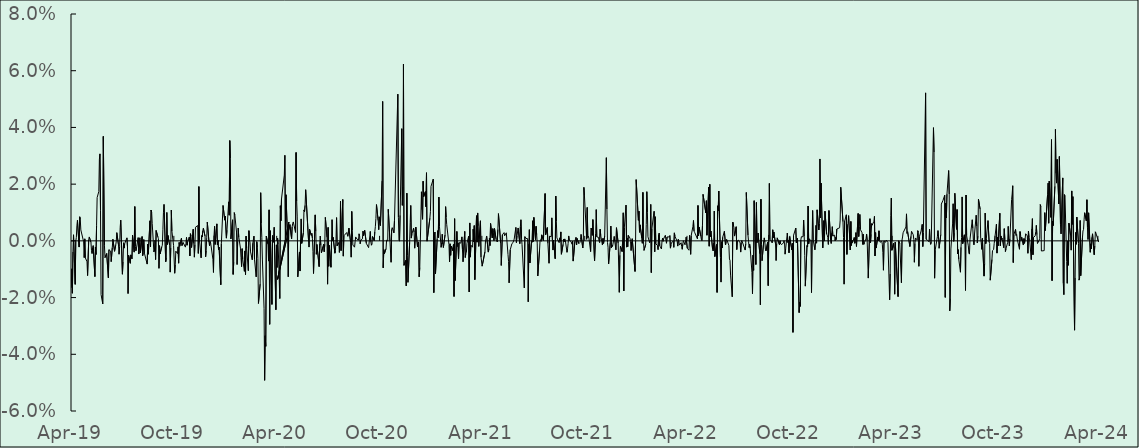
| Category | Series 0 |
|---|---|
| 2019-04-01 | -0.017 |
| 2019-04-02 | -0.01 |
| 2019-04-03 | -0.018 |
| 2019-04-04 | -0.004 |
| 2019-04-05 | 0.002 |
| 2019-04-08 | -0.015 |
| 2019-04-09 | 0 |
| 2019-04-10 | 0.001 |
| 2019-04-11 | 0.005 |
| 2019-04-12 | 0.007 |
| 2019-04-15 | -0.002 |
| 2019-04-16 | 0.008 |
| 2019-04-17 | 0.008 |
| 2019-04-18 | 0.004 |
| 2019-04-23 | 0 |
| 2019-04-24 | -0.006 |
| 2019-04-25 | 0.001 |
| 2019-04-26 | -0.006 |
| 2019-04-29 | -0.007 |
| 2019-04-30 | -0.012 |
| 2019-05-02 | 0 |
| 2019-05-03 | 0.001 |
| 2019-05-06 | -0.001 |
| 2019-05-07 | -0.003 |
| 2019-05-08 | -0.004 |
| 2019-05-09 | -0.002 |
| 2019-05-10 | -0.002 |
| 2019-05-13 | -0.013 |
| 2019-05-14 | -0.002 |
| 2019-05-15 | -0.005 |
| 2019-05-16 | 0.005 |
| 2019-05-17 | 0.015 |
| 2019-05-20 | 0.017 |
| 2019-05-21 | 0.029 |
| 2019-05-22 | 0.031 |
| 2019-05-23 | 0.011 |
| 2019-05-24 | -0.019 |
| 2019-05-27 | -0.022 |
| 2019-05-28 | 0.037 |
| 2019-05-30 | -0.002 |
| 2019-05-31 | -0.006 |
| 2019-06-03 | -0.004 |
| 2019-06-06 | -0.013 |
| 2019-06-07 | -0.003 |
| 2019-06-10 | -0.004 |
| 2019-06-11 | -0.007 |
| 2019-06-13 | -0.002 |
| 2019-06-14 | 0.001 |
| 2019-06-17 | -0.004 |
| 2019-06-18 | -0.004 |
| 2019-06-19 | -0.002 |
| 2019-06-20 | 0 |
| 2019-06-21 | 0.003 |
| 2019-06-24 | -0.001 |
| 2019-06-25 | -0.005 |
| 2019-06-26 | -0.002 |
| 2019-06-27 | 0.005 |
| 2019-06-28 | 0.007 |
| 2019-07-01 | -0.012 |
| 2019-07-02 | -0.007 |
| 2019-07-03 | -0.001 |
| 2019-07-04 | -0.003 |
| 2019-07-05 | -0.001 |
| 2019-07-08 | 0.001 |
| 2019-07-09 | 0.001 |
| 2019-07-10 | -0.002 |
| 2019-07-11 | -0.019 |
| 2019-07-12 | -0.005 |
| 2019-07-15 | -0.008 |
| 2019-07-16 | -0.005 |
| 2019-07-17 | -0.006 |
| 2019-07-18 | -0.006 |
| 2019-07-19 | 0.002 |
| 2019-07-22 | -0.004 |
| 2019-07-23 | 0.012 |
| 2019-07-24 | -0.002 |
| 2019-07-25 | -0.003 |
| 2019-07-26 | -0.003 |
| 2019-07-29 | 0.001 |
| 2019-07-30 | -0.005 |
| 2019-07-31 | -0.004 |
| 2019-08-01 | 0.001 |
| 2019-08-02 | -0.004 |
| 2019-08-05 | 0.002 |
| 2019-08-06 | -0.005 |
| 2019-08-07 | -0.004 |
| 2019-08-08 | 0 |
| 2019-08-09 | -0.004 |
| 2019-08-14 | -0.008 |
| 2019-08-15 | -0.001 |
| 2019-08-16 | -0.005 |
| 2019-08-19 | 0.007 |
| 2019-08-20 | -0.002 |
| 2019-08-21 | 0.011 |
| 2019-08-22 | 0.01 |
| 2019-08-23 | 0.006 |
| 2019-08-26 | -0.004 |
| 2019-08-27 | -0.003 |
| 2019-08-28 | 0 |
| 2019-08-29 | -0.007 |
| 2019-08-30 | 0.004 |
| 2019-09-02 | 0.001 |
| 2019-09-03 | 0.001 |
| 2019-09-04 | -0.01 |
| 2019-09-05 | -0.002 |
| 2019-09-06 | -0.005 |
| 2019-09-09 | -0.002 |
| 2019-09-10 | -0.002 |
| 2019-09-11 | 0.004 |
| 2019-09-12 | 0.01 |
| 2019-09-13 | 0.013 |
| 2019-09-16 | -0.007 |
| 2019-09-17 | -0.006 |
| 2019-09-18 | 0.01 |
| 2019-09-19 | -0.001 |
| 2019-09-20 | 0.002 |
| 2019-09-23 | -0.001 |
| 2019-09-24 | -0.011 |
| 2019-09-25 | -0.003 |
| 2019-09-26 | 0.011 |
| 2019-09-27 | 0.003 |
| 2019-09-30 | -0.002 |
| 2019-10-02 | -0.011 |
| 2019-10-03 | -0.008 |
| 2019-10-04 | -0.004 |
| 2019-10-07 | -0.004 |
| 2019-10-08 | -0.002 |
| 2019-10-09 | -0.008 |
| 2019-10-10 | -0.001 |
| 2019-10-11 | -0.002 |
| 2019-10-14 | 0.001 |
| 2019-10-15 | -0.002 |
| 2019-10-16 | -0.002 |
| 2019-10-17 | -0.001 |
| 2019-10-18 | 0 |
| 2019-10-21 | -0.002 |
| 2019-10-22 | -0.001 |
| 2019-10-23 | 0.001 |
| 2019-10-24 | -0.002 |
| 2019-10-25 | 0 |
| 2019-10-28 | 0.001 |
| 2019-10-29 | -0.005 |
| 2019-10-30 | 0.003 |
| 2019-10-31 | 0.002 |
| 2019-11-01 | -0.002 |
| 2019-11-04 | 0.004 |
| 2019-11-05 | -0.001 |
| 2019-11-06 | -0.006 |
| 2019-11-07 | -0.001 |
| 2019-11-08 | 0.005 |
| 2019-11-12 | 0.005 |
| 2019-11-13 | -0.004 |
| 2019-11-14 | 0.019 |
| 2019-11-15 | 0 |
| 2019-11-18 | -0.006 |
| 2019-11-19 | 0.002 |
| 2019-11-20 | 0.001 |
| 2019-11-21 | 0.004 |
| 2019-11-22 | 0.004 |
| 2019-11-25 | 0.002 |
| 2019-11-26 | -0.006 |
| 2019-11-27 | -0.003 |
| 2019-11-28 | 0.001 |
| 2019-11-29 | 0.007 |
| 2019-12-02 | 0 |
| 2019-12-03 | -0.002 |
| 2019-12-04 | 0 |
| 2019-12-05 | -0.001 |
| 2019-12-06 | -0.002 |
| 2019-12-09 | -0.006 |
| 2019-12-10 | -0.011 |
| 2019-12-11 | 0.002 |
| 2019-12-12 | 0.005 |
| 2019-12-13 | -0.001 |
| 2019-12-16 | 0.006 |
| 2019-12-17 | -0.001 |
| 2019-12-18 | 0 |
| 2019-12-19 | -0.003 |
| 2019-12-20 | -0.002 |
| 2019-12-23 | -0.015 |
| 2019-12-24 | -0.001 |
| 2019-12-27 | 0.012 |
| 2019-12-30 | 0.007 |
| 2019-12-31 | 0.009 |
| 2020-01-02 | 0.001 |
| 2020-01-03 | 0.004 |
| 2020-01-06 | 0.014 |
| 2020-01-07 | 0.009 |
| 2020-01-08 | 0.035 |
| 2020-01-09 | 0.029 |
| 2020-01-10 | 0.001 |
| 2020-01-13 | 0.007 |
| 2020-01-14 | -0.012 |
| 2020-01-15 | -0.008 |
| 2020-01-16 | 0.01 |
| 2020-01-17 | 0.009 |
| 2020-01-20 | 0.003 |
| 2020-01-21 | -0.008 |
| 2020-01-22 | 0 |
| 2020-01-23 | 0.005 |
| 2020-01-24 | 0.001 |
| 2020-01-27 | -0.003 |
| 2020-01-28 | -0.006 |
| 2020-01-29 | -0.009 |
| 2020-01-30 | -0.003 |
| 2020-01-31 | -0.006 |
| 2020-02-03 | -0.011 |
| 2020-02-04 | -0.004 |
| 2020-02-05 | -0.012 |
| 2020-02-06 | 0.002 |
| 2020-02-07 | -0.003 |
| 2020-02-10 | -0.011 |
| 2020-02-11 | 0.004 |
| 2020-02-12 | 0 |
| 2020-02-13 | 0 |
| 2020-02-14 | -0.004 |
| 2020-02-17 | -0.007 |
| 2020-02-18 | -0.001 |
| 2020-02-19 | -0.001 |
| 2020-02-20 | 0.002 |
| 2020-02-21 | -0.007 |
| 2020-02-24 | -0.013 |
| 2020-02-25 | 0 |
| 2020-02-26 | -0.002 |
| 2020-02-27 | -0.006 |
| 2020-02-28 | -0.022 |
| 2020-03-02 | -0.015 |
| 2020-03-03 | 0.017 |
| 2020-03-04 | 0.006 |
| 2020-03-05 | 0.001 |
| 2020-03-06 | -0.006 |
| 2020-03-09 | -0.024 |
| 2020-03-10 | -0.049 |
| 2020-03-11 | -0.033 |
| 2020-03-12 | -0.037 |
| 2020-03-13 | 0.002 |
| 2020-03-16 | -0.001 |
| 2020-03-17 | -0.007 |
| 2020-03-18 | 0.011 |
| 2020-03-19 | -0.029 |
| 2020-03-20 | 0.004 |
| 2020-03-23 | -0.022 |
| 2020-03-24 | 0.002 |
| 2020-03-25 | -0.001 |
| 2020-03-26 | 0.001 |
| 2020-03-27 | 0.005 |
| 2020-03-30 | -0.024 |
| 2020-03-31 | -0.001 |
| 2020-04-01 | -0.009 |
| 2020-04-02 | 0.001 |
| 2020-04-03 | -0.001 |
| 2020-04-06 | -0.02 |
| 2020-04-07 | 0.012 |
| 2020-04-08 | 0.007 |
| 2020-04-09 | 0.015 |
| 2020-04-14 | 0.023 |
| 2020-04-15 | 0.03 |
| 2020-04-16 | 0.001 |
| 2020-04-17 | 0.016 |
| 2020-04-20 | 0 |
| 2020-04-21 | -0.013 |
| 2020-04-22 | 0.007 |
| 2020-04-02 | -0.014 |
| 2020-04-24 | 0.006 |
| 2020-04-27 | 0.001 |
| 2020-04-28 | 0.005 |
| 2020-04-29 | 0.006 |
| 2020-04-30 | 0.007 |
| 2020-05-04 | 0.003 |
| 2020-05-05 | 0.031 |
| 2020-05-06 | 0.014 |
| 2020-05-07 | 0.009 |
| 2020-05-08 | -0.013 |
| 2020-05-11 | -0.004 |
| 2020-05-12 | -0.011 |
| 2020-05-13 | 0.001 |
| 2020-05-14 | 0.008 |
| 2020-05-15 | -0.001 |
| 2020-05-18 | 0.003 |
| 2020-05-19 | 0.011 |
| 2020-05-20 | 0.01 |
| 2020-05-21 | 0.013 |
| 2020-05-22 | 0.018 |
| 2020-05-27 | 0.001 |
| 2020-05-28 | -0.002 |
| 2020-05-29 | 0.004 |
| 2020-06-01 | 0.002 |
| 2020-06-02 | 0.003 |
| 2020-06-03 | 0.001 |
| 2020-06-04 | -0.004 |
| 2020-06-05 | -0.012 |
| 2020-06-08 | 0.009 |
| 2020-06-09 | 0.003 |
| 2020-06-10 | -0.005 |
| 2020-06-11 | -0.001 |
| 2020-06-15 | -0.009 |
| 2020-06-16 | -0.001 |
| 2020-06-17 | 0.002 |
| 2020-06-18 | -0.002 |
| 2020-06-19 | -0.004 |
| 2020-06-22 | -0.002 |
| 2020-06-23 | -0.001 |
| 2020-06-24 | -0.004 |
| 2020-06-25 | -0.001 |
| 2020-06-26 | 0.008 |
| 2020-06-29 | 0.001 |
| 2020-06-30 | -0.015 |
| 2020-07-01 | 0.005 |
| 2020-07-02 | -0.009 |
| 2020-07-03 | -0.002 |
| 2020-07-06 | -0.009 |
| 2020-07-07 | 0 |
| 2020-07-08 | 0.007 |
| 2020-07-09 | 0 |
| 2020-07-10 | 0.001 |
| 2020-07-13 | -0.004 |
| 2020-07-14 | -0.003 |
| 2020-07-15 | 0.001 |
| 2020-07-16 | 0.008 |
| 2020-07-17 | -0.002 |
| 2020-07-20 | -0.001 |
| 2020-07-21 | -0.004 |
| 2020-07-22 | 0 |
| 2020-07-23 | 0.014 |
| 2020-07-24 | -0.003 |
| 2020-07-27 | 0.015 |
| 2020-07-28 | -0.005 |
| 2020-07-29 | 0.002 |
| 2020-08-03 | 0.003 |
| 2020-08-04 | 0.003 |
| 2020-08-05 | 0.002 |
| 2020-08-06 | 0.002 |
| 2020-08-07 | 0.004 |
| 2020-08-10 | -0.001 |
| 2020-08-11 | -0.006 |
| 2020-08-12 | 0.01 |
| 2020-08-13 | 0.004 |
| 2020-08-14 | -0.001 |
| 2020-08-17 | -0.002 |
| 2020-08-18 | 0 |
| 2020-08-19 | 0.001 |
| 2020-08-20 | 0.001 |
| 2020-08-21 | 0.001 |
| 2020-08-24 | 0 |
| 2020-08-25 | 0.002 |
| 2020-08-26 | 0.002 |
| 2020-08-27 | -0.001 |
| 2020-08-28 | 0 |
| 2020-08-31 | 0.001 |
| 2020-09-01 | 0.003 |
| 2020-09-02 | 0.002 |
| 2020-09-03 | 0.002 |
| 2020-09-04 | 0.004 |
| 2020-09-07 | -0.001 |
| 2020-09-11 | -0.002 |
| 2020-09-14 | 0.003 |
| 2020-09-15 | 0 |
| 2020-09-16 | -0.002 |
| 2020-09-17 | -0.001 |
| 2020-09-18 | 0.002 |
| 2020-09-21 | 0 |
| 2020-09-22 | 0.003 |
| 2020-09-23 | 0.005 |
| 2020-09-24 | 0.008 |
| 2020-09-25 | 0.013 |
| 2020-09-28 | 0.007 |
| 2020-09-29 | 0.004 |
| 2020-09-30 | 0.008 |
| 2020-10-02 | 0.005 |
| 2020-10-05 | 0.021 |
| 2020-10-06 | 0.049 |
| 2020-10-07 | -0.01 |
| 2020-10-08 | -0.003 |
| 2020-10-09 | -0.005 |
| 2020-10-12 | -0.003 |
| 2020-10-13 | 0 |
| 2020-10-14 | 0 |
| 2020-10-15 | 0 |
| 2020-10-16 | 0.011 |
| 2020-10-19 | 0 |
| 2020-10-20 | 0 |
| 2020-10-21 | -0.008 |
| 2020-10-22 | 0.004 |
| 2020-10-23 | 0.005 |
| 2020-10-26 | 0.003 |
| 2020-10-27 | 0.007 |
| 2020-11-02 | 0.052 |
| 2020-11-03 | 0.008 |
| 2020-11-04 | 0 |
| 2020-11-05 | 0 |
| 2020-11-06 | 0.009 |
| 2020-11-09 | 0.04 |
| 2020-11-10 | 0.013 |
| 2020-11-11 | 0.019 |
| 2020-11-12 | 0.062 |
| 2020-11-13 | -0.009 |
| 2020-11-16 | -0.007 |
| 2020-11-17 | -0.016 |
| 2020-11-18 | 0.017 |
| 2020-11-19 | -0.005 |
| 2020-11-20 | -0.015 |
| 2020-11-23 | -0.001 |
| 2020-11-24 | 0.006 |
| 2020-11-25 | 0.012 |
| 2020-11-26 | 0.001 |
| 2020-11-27 | 0.002 |
| 2020-11-30 | 0.004 |
| 2020-12-01 | 0.003 |
| 2020-12-02 | -0.003 |
| 2020-12-03 | -0.003 |
| 2020-12-04 | 0.005 |
| 2020-12-07 | -0.002 |
| 2020-12-08 | -0.001 |
| 2020-12-09 | 0 |
| 2020-12-10 | -0.013 |
| 2020-12-11 | -0.009 |
| 2020-12-14 | 0.017 |
| 2020-12-15 | 0.011 |
| 2020-12-16 | 0.008 |
| 2020-12-17 | 0.021 |
| 2020-12-18 | 0.016 |
| 2020-12-21 | 0.017 |
| 2020-12-22 | 0.012 |
| 2020-12-23 | 0.024 |
| 2020-12-24 | 0 |
| 2020-12-29 | 0.008 |
| 2020-12-30 | 0.01 |
| 2020-12-31 | 0.019 |
| 2021-01-04 | 0.022 |
| 2021-01-05 | -0.018 |
| 2021-01-06 | 0.002 |
| 2021-01-07 | 0.003 |
| 2021-01-08 | -0.012 |
| 2021-01-11 | 0.001 |
| 2021-01-12 | 0.004 |
| 2021-01-13 | 0.001 |
| 2021-01-14 | 0.015 |
| 2021-01-15 | 0.005 |
| 2021-01-18 | -0.002 |
| 2021-01-19 | -0.001 |
| 2021-01-20 | 0.002 |
| 2021-01-21 | -0.001 |
| 2021-01-22 | -0.002 |
| 2021-01-25 | 0.002 |
| 2021-01-26 | 0.012 |
| 2021-01-27 | 0.008 |
| 2021-01-28 | 0.006 |
| 2021-01-29 | 0.006 |
| 2021-02-01 | -0.001 |
| 2021-02-02 | -0.007 |
| 2021-02-03 | -0.001 |
| 2021-02-04 | -0.005 |
| 2021-02-05 | -0.002 |
| 2021-02-08 | -0.003 |
| 2021-02-09 | -0.001 |
| 2021-02-10 | -0.02 |
| 2021-02-11 | 0.008 |
| 2021-02-12 | -0.014 |
| 2021-02-15 | 0.003 |
| 2021-02-16 | -0.002 |
| 2021-02-17 | -0.001 |
| 2021-02-18 | -0.006 |
| 2021-02-19 | -0.001 |
| 2021-02-22 | -0.001 |
| 2021-02-23 | 0 |
| 2021-02-24 | 0.001 |
| 2021-02-25 | -0.003 |
| 2021-02-26 | -0.007 |
| 2021-03-01 | 0.003 |
| 2021-03-02 | -0.006 |
| 2021-03-03 | -0.004 |
| 2021-03-04 | -0.004 |
| 2021-03-05 | -0.001 |
| 2021-03-08 | 0.002 |
| 2021-03-09 | -0.018 |
| 2021-03-10 | 0.006 |
| 2021-03-11 | -0.006 |
| 2021-03-12 | -0.002 |
| 2021-03-15 | -0.002 |
| 2021-03-16 | 0.004 |
| 2021-03-17 | 0 |
| 2021-03-18 | 0.005 |
| 2021-03-19 | -0.014 |
| 2021-03-22 | 0.009 |
| 2021-03-23 | 0 |
| 2021-03-24 | 0.01 |
| 2021-03-25 | 0.005 |
| 2021-03-26 | -0.002 |
| 2021-03-29 | 0.007 |
| 2021-03-30 | -0.006 |
| 2021-04-01 | -0.009 |
| 2021-04-06 | -0.004 |
| 2021-04-07 | 0 |
| 2021-04-08 | 0.001 |
| 2021-04-09 | 0.002 |
| 2021-04-12 | -0.004 |
| 2021-04-13 | -0.003 |
| 2021-04-14 | 0.001 |
| 2021-04-15 | -0.002 |
| 2021-04-16 | 0.006 |
| 2021-04-19 | 0.001 |
| 2021-04-20 | 0.004 |
| 2021-04-21 | 0.003 |
| 2021-04-22 | 0 |
| 2021-04-23 | 0.004 |
| 2021-04-26 | 0 |
| 2021-04-28 | 0 |
| 2021-04-29 | 0.004 |
| 2021-04-30 | 0.01 |
| 2021-05-04 | -0.001 |
| 2021-05-05 | -0.009 |
| 2021-05-06 | -0.009 |
| 2021-05-07 | 0.002 |
| 2021-05-10 | 0.003 |
| 2021-05-11 | 0.002 |
| 2021-05-14 | 0.003 |
| 2021-05-17 | -0.005 |
| 2021-05-18 | -0.007 |
| 2021-05-19 | -0.015 |
| 2021-05-21 | -0.003 |
| 2021-05-24 | -0.001 |
| 2021-05-25 | -0.001 |
| 2021-05-26 | -0.001 |
| 2021-05-28 | 0.001 |
| 2021-05-31 | 0.005 |
| 2021-06-01 | -0.001 |
| 2021-06-02 | 0.002 |
| 2021-06-03 | 0.002 |
| 2021-06-04 | 0.005 |
| 2021-06-07 | -0.001 |
| 2021-06-08 | 0.005 |
| 2021-06-09 | 0.007 |
| 2021-06-10 | 0.001 |
| 2021-06-11 | -0.001 |
| 2021-06-15 | -0.017 |
| 2021-06-16 | 0.001 |
| 2021-06-17 | 0.001 |
| 2021-06-18 | 0.001 |
| 2021-06-21 | 0.001 |
| 2021-06-22 | -0.021 |
| 2021-06-23 | -0.001 |
| 2021-06-24 | 0.004 |
| 2021-06-25 | -0.008 |
| 2021-06-28 | 0 |
| 2021-06-29 | 0 |
| 2021-06-30 | 0.007 |
| 2021-07-01 | 0 |
| 2021-07-02 | 0.008 |
| 2021-07-05 | 0 |
| 2021-07-06 | 0.005 |
| 2021-07-07 | 0.002 |
| 2021-07-08 | -0.001 |
| 2021-07-09 | -0.012 |
| 2021-07-12 | -0.004 |
| 2021-07-13 | 0 |
| 2021-07-14 | 0 |
| 2021-07-15 | 0 |
| 2021-07-16 | 0.002 |
| 2021-07-19 | 0 |
| 2021-07-22 | 0.017 |
| 2021-07-23 | 0.002 |
| 2021-07-26 | 0.005 |
| 2021-07-27 | -0.001 |
| 2021-07-28 | -0.001 |
| 2021-07-29 | -0.008 |
| 2021-07-30 | 0.002 |
| 2021-08-02 | 0.001 |
| 2021-08-03 | 0.008 |
| 2021-08-04 | 0 |
| 2021-08-05 | -0.003 |
| 2021-08-06 | 0 |
| 2021-08-09 | -0.006 |
| 2021-08-10 | 0.016 |
| 2021-08-11 | 0.007 |
| 2021-08-12 | 0.001 |
| 2021-08-13 | 0.001 |
| 2021-08-16 | -0.001 |
| 2021-08-17 | 0.001 |
| 2021-08-18 | 0 |
| 2021-08-19 | 0.003 |
| 2021-08-20 | -0.005 |
| 2021-08-23 | -0.001 |
| 2021-08-24 | 0.001 |
| 2021-08-25 | 0 |
| 2021-08-26 | 0.001 |
| 2021-08-27 | 0 |
| 2021-08-30 | -0.004 |
| 2021-08-31 | -0.003 |
| 2021-09-01 | -0.001 |
| 2021-09-02 | 0.002 |
| 2021-09-03 | 0 |
| 2021-09-06 | 0 |
| 2021-09-07 | 0 |
| 2021-09-08 | -0.001 |
| 2021-09-09 | 0 |
| 2021-09-10 | -0.007 |
| 2021-09-13 | 0 |
| 2021-09-14 | 0 |
| 2021-09-15 | 0.001 |
| 2021-09-16 | -0.001 |
| 2021-09-17 | 0.001 |
| 2021-09-20 | -0.001 |
| 2021-09-21 | -0.001 |
| 2021-09-22 | -0.001 |
| 2021-09-23 | 0.001 |
| 2021-09-24 | 0.002 |
| 2021-09-27 | -0.003 |
| 2021-09-28 | 0 |
| 2021-09-29 | 0.019 |
| 2021-09-30 | 0.016 |
| 2021-10-04 | 0.001 |
| 2021-10-05 | 0.012 |
| 2021-10-06 | 0.001 |
| 2021-10-07 | 0.002 |
| 2021-10-08 | 0.001 |
| 2021-10-11 | -0.004 |
| 2021-10-12 | 0.004 |
| 2021-10-13 | 0.004 |
| 2021-10-14 | 0.002 |
| 2021-10-15 | 0.007 |
| 2021-10-18 | -0.007 |
| 2021-10-20 | 0.003 |
| 2021-10-21 | 0.011 |
| 2021-10-22 | 0.001 |
| 2021-10-25 | 0.001 |
| 2021-10-26 | 0 |
| 2021-10-27 | -0.001 |
| 2021-10-28 | 0.004 |
| 2021-10-29 | 0.002 |
| 2021-11-01 | -0.001 |
| 2021-11-02 | 0.001 |
| 2021-11-03 | -0.001 |
| 2021-11-04 | -0.001 |
| 2021-11-05 | 0.002 |
| 2021-11-08 | 0.029 |
| 2021-11-09 | 0.011 |
| 2021-11-10 | -0.001 |
| 2021-11-11 | -0.002 |
| 2021-11-12 | -0.008 |
| 2021-11-15 | -0.001 |
| 2021-11-16 | 0.005 |
| 2021-11-17 | -0.002 |
| 2021-11-18 | -0.001 |
| 2021-11-19 | -0.002 |
| 2021-11-22 | 0.002 |
| 2021-11-23 | 0 |
| 2021-11-24 | 0 |
| 2021-11-25 | -0.003 |
| 2021-11-26 | 0.005 |
| 2021-11-29 | -0.001 |
| 2021-11-30 | -0.001 |
| 2021-12-01 | -0.018 |
| 2021-12-02 | -0.005 |
| 2021-12-03 | -0.002 |
| 2021-12-06 | -0.004 |
| 2021-12-07 | 0 |
| 2021-12-08 | 0.01 |
| 2021-12-09 | -0.018 |
| 2021-12-10 | 0.005 |
| 2021-12-13 | 0.013 |
| 2021-12-14 | -0.002 |
| 2021-12-15 | 0.001 |
| 2021-12-16 | -0.002 |
| 2021-12-17 | 0.002 |
| 2021-12-20 | 0.001 |
| 2021-12-21 | 0 |
| 2021-12-22 | -0.003 |
| 2021-12-23 | 0 |
| 2021-12-24 | 0.001 |
| 2021-12-29 | -0.011 |
| 2021-12-30 | 0 |
| 2021-12-31 | 0.022 |
| 2022-01-04 | 0.007 |
| 2022-01-05 | 0.01 |
| 2022-01-06 | 0.003 |
| 2022-01-07 | 0.006 |
| 2022-01-10 | 0.001 |
| 2022-01-11 | -0.001 |
| 2022-01-12 | 0.017 |
| 2022-01-13 | 0 |
| 2022-01-14 | -0.003 |
| 2022-01-17 | -0.001 |
| 2022-01-18 | 0.006 |
| 2022-01-19 | 0.017 |
| 2022-01-20 | 0.01 |
| 2022-01-21 | 0.001 |
| 2022-01-24 | -0.001 |
| 2022-01-25 | 0 |
| 2022-01-26 | 0.013 |
| 2022-01-27 | -0.011 |
| 2022-01-28 | 0.004 |
| 2022-01-31 | 0.009 |
| 2022-02-01 | 0.01 |
| 2022-02-02 | -0.004 |
| 2022-02-03 | 0.009 |
| 2022-02-04 | -0.001 |
| 2022-02-07 | -0.002 |
| 2022-02-08 | -0.003 |
| 2022-02-09 | 0.002 |
| 2022-02-10 | 0.003 |
| 2022-02-11 | -0.002 |
| 2022-02-14 | -0.003 |
| 2022-02-15 | 0 |
| 2022-02-16 | 0.001 |
| 2022-02-17 | 0 |
| 2022-02-18 | 0.001 |
| 2022-02-21 | 0.002 |
| 2022-02-22 | 0 |
| 2022-02-23 | -0.001 |
| 2022-02-24 | 0.001 |
| 2022-02-25 | 0.001 |
| 2022-02-28 | 0.001 |
| 2022-03-01 | 0.002 |
| 2022-03-02 | -0.003 |
| 2022-03-03 | -0.001 |
| 2022-03-04 | -0.001 |
| 2022-03-07 | 0 |
| 2022-03-08 | -0.002 |
| 2022-03-09 | 0.003 |
| 2022-03-10 | 0.002 |
| 2022-03-11 | 0.002 |
| 2022-03-14 | 0 |
| 2022-03-15 | -0.002 |
| 2022-03-16 | 0 |
| 2022-03-17 | 0 |
| 2022-03-18 | -0.001 |
| 2022-03-21 | -0.001 |
| 2022-03-22 | -0.002 |
| 2022-03-23 | -0.003 |
| 2022-03-24 | -0.001 |
| 2022-03-25 | 0 |
| 2022-03-28 | -0.001 |
| 2022-03-29 | -0.001 |
| 2022-03-30 | 0.001 |
| 2022-03-31 | 0.001 |
| 2022-04-01 | -0.003 |
| 2022-04-04 | -0.003 |
| 2022-04-05 | 0.002 |
| 2022-04-06 | 0 |
| 2022-04-07 | -0.005 |
| 2022-04-08 | 0.002 |
| 2022-04-11 | 0.005 |
| 2022-04-12 | 0.007 |
| 2022-04-13 | 0.003 |
| 2022-04-14 | 0.003 |
| 2022-04-19 | 0.001 |
| 2022-04-20 | 0.012 |
| 2022-04-21 | 0.002 |
| 2022-04-22 | 0.005 |
| 2022-04-25 | 0.002 |
| 2022-04-26 | 0.001 |
| 2022-04-27 | 0 |
| 2022-04-28 | 0.005 |
| 2022-04-29 | 0.016 |
| 2022-05-04 | 0.01 |
| 2022-05-05 | 0.014 |
| 2022-05-06 | 0.002 |
| 2022-05-09 | 0.019 |
| 2022-05-10 | -0.002 |
| 2022-05-11 | 0.02 |
| 2022-05-12 | 0.002 |
| 2022-05-13 | 0.003 |
| 2022-05-16 | -0.003 |
| 2022-05-17 | -0.004 |
| 2022-05-18 | -0.001 |
| 2022-05-19 | 0.011 |
| 2022-05-20 | -0.006 |
| 2022-05-23 | -0.001 |
| 2022-05-24 | -0.018 |
| 2022-05-25 | 0.012 |
| 2022-05-26 | 0.011 |
| 2022-05-27 | 0.018 |
| 2022-05-30 | -0.006 |
| 2022-05-31 | -0.015 |
| 2022-06-01 | 0 |
| 2022-06-02 | -0.003 |
| 2022-06-03 | 0.001 |
| 2022-06-06 | 0.003 |
| 2022-06-07 | 0.003 |
| 2022-06-08 | -0.001 |
| 2022-06-09 | 0 |
| 2022-06-10 | 0.001 |
| 2022-06-14 | -0.002 |
| 2022-06-15 | -0.006 |
| 2022-06-16 | -0.007 |
| 2022-06-17 | -0.012 |
| 2022-06-20 | -0.02 |
| 2022-06-21 | 0.007 |
| 2022-06-22 | 0.006 |
| 2022-06-23 | 0.005 |
| 2022-06-24 | 0.002 |
| 2022-06-27 | 0.005 |
| 2022-06-28 | -0.003 |
| 2022-06-29 | 0 |
| 2022-06-30 | 0 |
| 2022-07-01 | 0 |
| 2022-07-04 | -0.001 |
| 2022-07-05 | -0.004 |
| 2022-07-06 | -0.001 |
| 2022-07-07 | 0 |
| 2022-07-08 | 0 |
| 2022-07-13 | -0.003 |
| 2022-07-14 | -0.001 |
| 2022-07-15 | 0.017 |
| 2022-07-18 | 0.002 |
| 2022-07-19 | 0 |
| 2022-07-20 | -0.002 |
| 2022-07-21 | -0.001 |
| 2022-07-22 | -0.003 |
| 2022-07-25 | -0.011 |
| 2022-07-26 | -0.019 |
| 2022-07-27 | -0.005 |
| 2022-07-28 | -0.01 |
| 2022-07-29 | 0.014 |
| 2022-08-01 | -0.008 |
| 2022-08-02 | 0.014 |
| 2022-08-03 | -0.001 |
| 2022-08-04 | 0 |
| 2022-08-05 | 0.003 |
| 2022-08-08 | -0.005 |
| 2022-08-09 | -0.023 |
| 2022-08-10 | 0.015 |
| 2022-08-11 | -0.001 |
| 2022-08-12 | -0.007 |
| 2022-08-15 | 0 |
| 2022-08-16 | 0.001 |
| 2022-08-17 | 0 |
| 2022-08-18 | -0.003 |
| 2022-08-19 | -0.004 |
| 2022-08-22 | 0 |
| 2022-08-23 | -0.016 |
| 2022-08-24 | 0.002 |
| 2022-08-25 | 0.02 |
| 2022-08-26 | 0 |
| 2022-08-29 | 0 |
| 2022-08-30 | -0.001 |
| 2022-08-31 | 0.004 |
| 2022-09-01 | 0.001 |
| 2022-09-02 | 0.003 |
| 2022-09-05 | -0.001 |
| 2022-09-06 | -0.007 |
| 2022-09-07 | -0.001 |
| 2022-09-08 | 0.001 |
| 2022-09-09 | 0.001 |
| 2022-09-12 | -0.001 |
| 2022-09-13 | 0 |
| 2022-09-14 | -0.001 |
| 2022-09-15 | -0.001 |
| 2022-09-16 | -0.001 |
| 2022-09-19 | -0.001 |
| 2022-09-20 | 0 |
| 2022-09-21 | 0 |
| 2022-09-22 | -0.005 |
| 2022-09-23 | -0.003 |
| 2022-09-26 | 0.003 |
| 2022-09-27 | -0.001 |
| 2022-09-28 | 0 |
| 2022-09-29 | -0.004 |
| 2022-09-30 | 0.001 |
| 2022-10-04 | -0.003 |
| 2022-10-05 | -0.001 |
| 2022-10-06 | -0.032 |
| 2022-10-07 | 0.002 |
| 2022-10-11 | 0.005 |
| 2022-10-12 | -0.001 |
| 2022-10-13 | 0 |
| 2022-10-14 | 0.001 |
| 2022-10-17 | -0.025 |
| 2022-10-18 | -0.022 |
| 2022-10-19 | -0.023 |
| 2022-10-20 | 0 |
| 2022-10-21 | 0.001 |
| 2022-10-24 | 0.001 |
| 2022-10-25 | 0.007 |
| 2022-10-26 | 0.002 |
| 2022-10-27 | -0.005 |
| 2022-10-28 | -0.016 |
| 2022-10-31 | -0.002 |
| 2022-11-01 | -0.002 |
| 2022-11-02 | 0.012 |
| 2022-11-03 | -0.001 |
| 2022-11-04 | 0.001 |
| 2022-11-07 | 0 |
| 2022-11-08 | -0.018 |
| 2022-11-09 | 0 |
| 2022-11-10 | 0.011 |
| 2022-11-11 | 0 |
| 2022-11-14 | -0.003 |
| 2022-11-15 | 0 |
| 2022-11-16 | 0.005 |
| 2022-11-17 | -0.001 |
| 2022-11-18 | 0.011 |
| 2022-11-21 | 0.004 |
| 2022-11-22 | 0.006 |
| 2022-11-23 | 0.029 |
| 2022-11-24 | 0.008 |
| 2022-11-25 | 0.02 |
| 2022-11-28 | -0.002 |
| 2022-11-29 | -0.002 |
| 2022-11-30 | 0.007 |
| 2022-12-01 | 0 |
| 2022-12-02 | 0.01 |
| 2022-12-05 | 0.002 |
| 2022-12-06 | 0.002 |
| 2022-12-07 | 0.001 |
| 2022-12-08 | -0.001 |
| 2022-12-09 | 0.011 |
| 2022-12-12 | 0 |
| 2022-12-13 | -0.001 |
| 2022-12-14 | 0.003 |
| 2022-12-15 | 0.005 |
| 2022-12-16 | 0.002 |
| 2022-12-19 | 0.002 |
| 2022-12-20 | 0 |
| 2022-12-21 | 0.001 |
| 2022-12-22 | 0 |
| 2022-12-23 | 0.004 |
| 2022-12-28 | 0.005 |
| 2022-12-29 | 0.007 |
| 2022-12-30 | 0.019 |
| 2023-01-03 | 0.007 |
| 2023-01-04 | 0.001 |
| 2023-01-05 | -0.015 |
| 2023-01-06 | 0.007 |
| 2023-01-09 | 0.009 |
| 2023-01-10 | -0.005 |
| 2023-01-11 | 0.006 |
| 2023-01-12 | 0.006 |
| 2023-01-13 | 0.009 |
| 2023-01-16 | -0.003 |
| 2023-01-17 | 0.007 |
| 2023-01-18 | -0.002 |
| 2023-01-19 | 0 |
| 2023-01-20 | -0.001 |
| 2023-01-23 | 0.001 |
| 2023-01-24 | -0.001 |
| 2023-01-25 | 0 |
| 2023-01-26 | 0.003 |
| 2023-01-27 | -0.002 |
| 2023-01-30 | 0.01 |
| 2023-01-31 | 0.002 |
| 2023-02-01 | 0.005 |
| 2023-02-02 | 0.009 |
| 2023-02-03 | 0.004 |
| 2023-02-06 | 0.003 |
| 2023-02-07 | -0.001 |
| 2023-02-08 | 0.002 |
| 2023-02-09 | -0.001 |
| 2023-02-10 | -0.001 |
| 2023-02-13 | 0.001 |
| 2023-02-14 | 0.002 |
| 2023-02-15 | 0 |
| 2023-02-16 | 0 |
| 2023-02-17 | -0.013 |
| 2023-02-20 | 0.008 |
| 2023-02-21 | -0.001 |
| 2023-02-22 | 0.002 |
| 2023-02-23 | 0.006 |
| 2023-02-24 | 0.006 |
| 2023-02-27 | 0.007 |
| 2023-02-28 | 0.009 |
| 2023-03-01 | -0.005 |
| 2023-03-02 | 0.003 |
| 2023-03-03 | -0.003 |
| 2023-03-06 | 0.001 |
| 2023-03-07 | 0 |
| 2023-03-08 | 0.004 |
| 2023-03-09 | 0 |
| 2023-03-10 | 0 |
| 2023-03-13 | 0 |
| 2023-03-14 | -0.001 |
| 2023-03-15 | -0.004 |
| 2023-03-16 | -0.01 |
| 2023-03-17 | 0 |
| 2023-03-20 | 0 |
| 2023-03-21 | 0 |
| 2023-03-22 | 0.001 |
| 2023-03-23 | 0 |
| 2023-03-24 | -0.001 |
| 2023-03-27 | -0.021 |
| 2023-03-28 | -0.012 |
| 2023-03-29 | 0.009 |
| 2023-03-30 | 0.015 |
| 2023-03-31 | -0.003 |
| 2023-04-03 | -0.001 |
| 2023-04-04 | -0.003 |
| 2023-04-05 | -0.019 |
| 2023-04-06 | 0 |
| 2023-04-11 | -0.02 |
| 2023-04-12 | 0 |
| 2023-04-13 | 0 |
| 2023-04-14 | -0.001 |
| 2023-04-17 | -0.015 |
| 2023-04-18 | 0 |
| 2023-04-19 | 0.001 |
| 2023-04-20 | 0.003 |
| 2023-04-25 | 0.005 |
| 2023-04-26 | 0.01 |
| 2023-04-27 | 0.003 |
| 2023-04-28 | 0.003 |
| 2023-05-02 | -0.002 |
| 2023-05-03 | -0.002 |
| 2023-05-04 | 0.002 |
| 2023-05-05 | 0.003 |
| 2023-05-08 | 0.002 |
| 2023-05-09 | 0 |
| 2023-05-10 | -0.008 |
| 2023-05-11 | -0.001 |
| 2023-05-12 | 0.001 |
| 2023-05-15 | 0 |
| 2023-05-16 | 0.004 |
| 2023-05-17 | 0.003 |
| 2023-05-18 | -0.009 |
| 2023-05-19 | 0.002 |
| 2023-05-22 | 0.003 |
| 2023-05-23 | 0.005 |
| 2023-05-24 | 0.006 |
| 2023-05-25 | -0.002 |
| 2023-05-26 | 0.003 |
| 2023-05-30 | 0.052 |
| 2023-05-31 | 0.001 |
| 2023-06-01 | 0.001 |
| 2023-06-02 | 0 |
| 2023-06-05 | 0 |
| 2023-06-06 | 0.004 |
| 2023-06-07 | 0 |
| 2023-06-08 | -0.001 |
| 2023-06-09 | 0 |
| 2023-06-13 | 0.04 |
| 2023-06-14 | 0.031 |
| 2023-06-15 | -0.013 |
| 2023-06-16 | -0.003 |
| 2023-06-19 | 0 |
| 2023-06-20 | 0.002 |
| 2023-06-21 | 0.004 |
| 2023-06-22 | 0.001 |
| 2023-06-23 | -0.003 |
| 2023-06-26 | 0.002 |
| 2023-06-27 | 0.013 |
| 2023-06-30 | 0.014 |
| 2023-07-03 | 0.016 |
| 2023-07-04 | -0.02 |
| 2023-07-05 | 0.013 |
| 2023-07-06 | 0.008 |
| 2023-07-07 | 0.016 |
| 2023-07-10 | 0.025 |
| 2023-07-11 | 0.016 |
| 2023-07-12 | -0.025 |
| 2023-07-13 | -0.02 |
| 2023-07-14 | -0.003 |
| 2023-07-17 | 0.006 |
| 2023-07-18 | 0.013 |
| 2023-07-19 | 0 |
| 2023-07-20 | 0.003 |
| 2023-07-21 | 0.017 |
| 2023-07-24 | 0.004 |
| 2023-07-25 | 0.011 |
| 2023-07-26 | -0.005 |
| 2023-07-27 | -0.003 |
| 2023-07-28 | -0.007 |
| 2023-07-31 | -0.011 |
| 2023-08-01 | -0.002 |
| 2023-08-02 | 0.001 |
| 2023-08-03 | 0.015 |
| 2023-08-04 | -0.001 |
| 2023-08-07 | 0.002 |
| 2023-08-08 | 0 |
| 2023-08-09 | -0.017 |
| 2023-08-10 | 0.016 |
| 2023-08-11 | 0.002 |
| 2023-08-14 | -0.002 |
| 2023-08-15 | -0.004 |
| 2023-08-16 | -0.005 |
| 2023-08-17 | 0.001 |
| 2023-08-18 | 0.001 |
| 2023-08-21 | 0.007 |
| 2023-08-22 | 0.004 |
| 2023-08-23 | 0 |
| 2023-08-24 | -0.001 |
| 2023-08-25 | 0.002 |
| 2023-08-28 | 0.009 |
| 2023-08-29 | 0.005 |
| 2023-08-30 | -0.001 |
| 2023-08-31 | 0.002 |
| 2023-09-01 | 0.015 |
| 2023-09-04 | 0.011 |
| 2023-09-05 | 0.001 |
| 2023-09-06 | -0.001 |
| 2023-09-07 | -0.003 |
| 2023-09-08 | 0.001 |
| 2023-09-11 | -0.012 |
| 2023-09-12 | -0.008 |
| 2023-09-13 | 0.01 |
| 2023-09-14 | -0.001 |
| 2023-09-15 | 0.001 |
| 2023-09-18 | 0.007 |
| 2023-09-19 | 0.007 |
| 2023-09-20 | 0 |
| 2023-09-21 | -0.001 |
| 2023-09-22 | -0.014 |
| 2023-09-25 | -0.007 |
| 2023-09-26 | -0.003 |
| 2023-09-28 | -0.003 |
| 2023-09-29 | -0.001 |
| 2023-10-03 | 0.006 |
| 2023-10-04 | -0.004 |
| 2023-10-05 | 0.001 |
| 2023-10-06 | -0.002 |
| 2023-10-09 | 0.01 |
| 2023-10-10 | -0.002 |
| 2023-10-11 | 0.002 |
| 2023-10-12 | 0 |
| 2023-10-13 | 0.001 |
| 2023-10-16 | -0.002 |
| 2023-10-17 | 0.004 |
| 2023-10-18 | 0 |
| 2023-10-19 | -0.004 |
| 2023-10-20 | -0.003 |
| 2023-10-23 | -0.001 |
| 2023-10-24 | 0.005 |
| 2023-10-25 | 0 |
| 2023-10-26 | -0.002 |
| 2023-10-27 | 0.001 |
| 2023-10-30 | 0.015 |
| 2023-10-31 | 0.017 |
| 2023-11-01 | 0.019 |
| 2023-11-02 | -0.008 |
| 2023-11-03 | 0.002 |
| 2023-11-06 | 0.004 |
| 2023-11-07 | 0.002 |
| 2023-11-08 | 0.002 |
| 2023-11-09 | 0.001 |
| 2023-11-10 | 0 |
| 2023-11-13 | -0.003 |
| 2023-11-14 | 0.003 |
| 2023-11-15 | 0.002 |
| 2023-11-16 | 0 |
| 2023-11-17 | 0.001 |
| 2023-11-20 | -0.001 |
| 2023-11-21 | 0.001 |
| 2023-11-22 | -0.001 |
| 2023-11-23 | 0.001 |
| 2023-11-24 | 0.003 |
| 2023-11-27 | 0.002 |
| 2023-11-28 | -0.004 |
| 2023-11-29 | 0.003 |
| 2023-11-30 | 0.001 |
| 2023-12-01 | 0.001 |
| 2023-12-04 | -0.007 |
| 2023-12-05 | 0.004 |
| 2023-12-06 | 0.008 |
| 2023-12-07 | -0.005 |
| 2023-12-08 | 0.001 |
| 2023-12-11 | 0.002 |
| 2023-12-12 | 0.003 |
| 2023-12-13 | 0.005 |
| 2023-12-14 | 0.002 |
| 2023-12-15 | -0.001 |
| 2023-12-18 | 0 |
| 2023-12-19 | 0.001 |
| 2023-12-20 | 0.013 |
| 2023-12-21 | 0.012 |
| 2023-12-22 | -0.004 |
| 2023-12-27 | -0.003 |
| 2023-12-28 | 0.01 |
| 2023-12-29 | 0.004 |
| 2024-01-02 | 0.016 |
| 2024-01-03 | 0.02 |
| 2024-01-04 | 0.006 |
| 2024-01-05 | 0.021 |
| 2024-01-08 | 0.008 |
| 2024-01-09 | 0.036 |
| 2024-01-10 | -0.014 |
| 2024-01-11 | 0.007 |
| 2024-01-12 | 0.005 |
| 2024-01-15 | 0.019 |
| 2024-01-16 | 0.039 |
| 2024-01-17 | 0.024 |
| 2024-01-18 | 0.02 |
| 2024-01-19 | 0.029 |
| 2024-01-22 | 0.013 |
| 2024-01-23 | 0.03 |
| 2024-01-24 | 0.03 |
| 2024-01-25 | 0.006 |
| 2024-01-26 | 0.002 |
| 2024-01-29 | 0.022 |
| 2024-01-30 | -0.015 |
| 2024-01-31 | -0.019 |
| 2024-02-01 | 0.016 |
| 2024-02-02 | 0.016 |
| 2024-02-05 | -0.007 |
| 2024-02-06 | -0.015 |
| 2024-02-07 | 0 |
| 2024-02-08 | -0.009 |
| 2024-02-09 | 0.006 |
| 2024-02-12 | 0.002 |
| 2024-02-13 | -0.003 |
| 2024-02-14 | 0.018 |
| 2024-02-15 | 0.006 |
| 2024-02-16 | 0.016 |
| 2024-02-19 | -0.031 |
| 2024-02-20 | -0.013 |
| 2024-02-21 | 0.003 |
| 2024-02-22 | -0.001 |
| 2024-02-23 | 0.008 |
| 2024-02-26 | -0.001 |
| 2024-02-27 | -0.014 |
| 2024-02-28 | -0.013 |
| 2024-02-29 | 0.007 |
| 2024-03-01 | -0.012 |
| 2024-03-04 | 0.001 |
| 2024-03-05 | 0.003 |
| 2024-03-06 | 0.004 |
| 2024-03-07 | 0.007 |
| 2024-03-08 | 0.01 |
| 2024-03-11 | 0.007 |
| 2024-03-12 | 0.014 |
| 2024-03-13 | 0.005 |
| 2024-03-14 | 0 |
| 2024-03-15 | 0.01 |
| 2024-03-18 | -0.004 |
| 2024-03-19 | -0.001 |
| 2024-03-20 | -0.003 |
| 2024-03-21 | 0.001 |
| 2024-03-22 | 0.002 |
| 2024-03-25 | -0.005 |
| 2024-03-26 | -0.002 |
| 2024-03-27 | 0.003 |
| 2024-03-28 | 0.003 |
| 2024-04-02 | 0 |